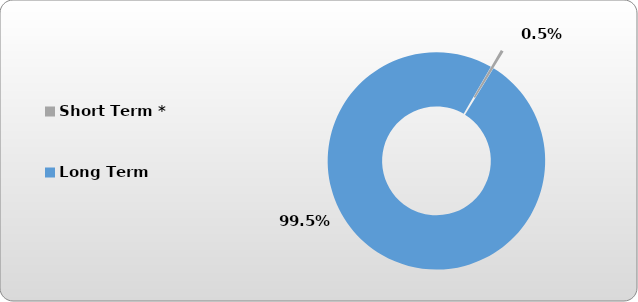
| Category | Short Term * |
|---|---|
| Short Term * | 2500 |
| Long Term | 540743.741 |